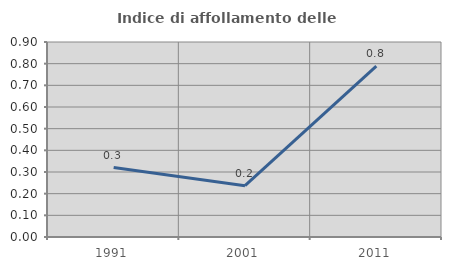
| Category | Indice di affollamento delle abitazioni  |
|---|---|
| 1991.0 | 0.321 |
| 2001.0 | 0.237 |
| 2011.0 | 0.789 |